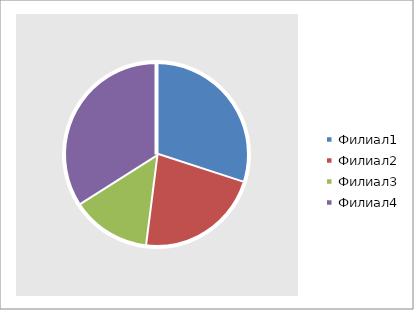
| Category | Прибыль |
|---|---|
| 0 | 6 |
| 1 | 4.4 |
| 2 | 2.8 |
| 3 | 6.8 |